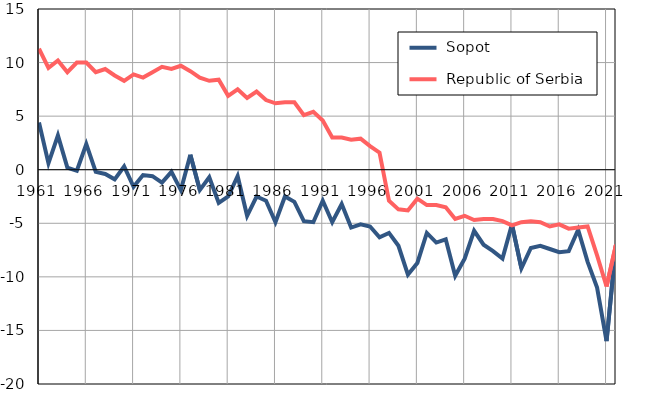
| Category |  Sopot |  Republic of Serbia |
|---|---|---|
| 1961.0 | 4.4 | 11.3 |
| 1962.0 | 0.6 | 9.5 |
| 1963.0 | 3.2 | 10.2 |
| 1964.0 | 0.2 | 9.1 |
| 1965.0 | -0.1 | 10 |
| 1966.0 | 2.4 | 10 |
| 1967.0 | -0.2 | 9.1 |
| 1968.0 | -0.4 | 9.4 |
| 1969.0 | -0.9 | 8.8 |
| 1970.0 | 0.3 | 8.3 |
| 1971.0 | -1.6 | 8.9 |
| 1972.0 | -0.5 | 8.6 |
| 1973.0 | -0.6 | 9.1 |
| 1974.0 | -1.2 | 9.6 |
| 1975.0 | -0.2 | 9.4 |
| 1976.0 | -1.9 | 9.7 |
| 1977.0 | 1.4 | 9.2 |
| 1978.0 | -1.9 | 8.6 |
| 1979.0 | -0.7 | 8.3 |
| 1980.0 | -3.1 | 8.4 |
| 1981.0 | -2.5 | 6.9 |
| 1982.0 | -0.6 | 7.5 |
| 1983.0 | -4.3 | 6.7 |
| 1984.0 | -2.5 | 7.3 |
| 1985.0 | -2.9 | 6.5 |
| 1986.0 | -4.9 | 6.2 |
| 1987.0 | -2.5 | 6.3 |
| 1988.0 | -3 | 6.3 |
| 1989.0 | -4.8 | 5.1 |
| 1990.0 | -4.9 | 5.4 |
| 1991.0 | -2.9 | 4.6 |
| 1992.0 | -4.9 | 3 |
| 1993.0 | -3.2 | 3 |
| 1994.0 | -5.4 | 2.8 |
| 1995.0 | -5.1 | 2.9 |
| 1996.0 | -5.3 | 2.2 |
| 1997.0 | -6.3 | 1.6 |
| 1998.0 | -5.9 | -2.9 |
| 1999.0 | -7.1 | -3.7 |
| 2000.0 | -9.8 | -3.8 |
| 2001.0 | -8.7 | -2.7 |
| 2002.0 | -5.9 | -3.3 |
| 2003.0 | -6.8 | -3.3 |
| 2004.0 | -6.5 | -3.5 |
| 2005.0 | -9.9 | -4.6 |
| 2006.0 | -8.3 | -4.3 |
| 2007.0 | -5.7 | -4.7 |
| 2008.0 | -7 | -4.6 |
| 2009.0 | -7.6 | -4.6 |
| 2010.0 | -8.3 | -4.8 |
| 2011.0 | -5.1 | -5.2 |
| 2012.0 | -9.2 | -4.9 |
| 2013.0 | -7.3 | -4.8 |
| 2014.0 | -7.1 | -4.9 |
| 2015.0 | -7.4 | -5.3 |
| 2016.0 | -7.7 | -5.1 |
| 2017.0 | -7.6 | -5.5 |
| 2018.0 | -5.6 | -5.4 |
| 2019.0 | -8.6 | -5.3 |
| 2020.0 | -11 | -8 |
| 2021.0 | -16 | -10.9 |
| 2022.0 | -7 | -7 |